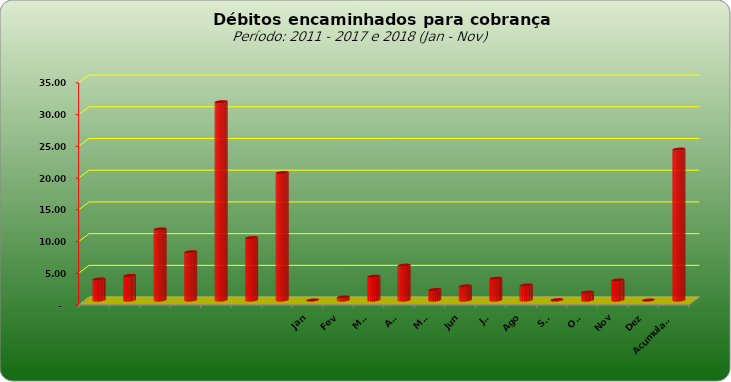
| Category |  3.309.443,02  |
|---|---|
|  | 3309443.02 |
|  | 3859728.44 |
|  | 11181928.25 |
|  | 7600526.01 |
|  | 31248623.5 |
|  | 9830198.34 |
|  | 20083556.95 |
| Jan | 0 |
| Fev | 468831.1 |
| Mar | 3741527.45 |
| Abr | 5493663.59 |
| Mai | 1643658.45 |
| Jun | 2215524.43 |
| Jul | 3425456.07 |
| Ago | 2362409.7 |
| Set | 48910.4 |
| Out | 1233325.4 |
| Nov | 3144659.97 |
| Dez | 0 |
| Acumulado | 23777966.56 |